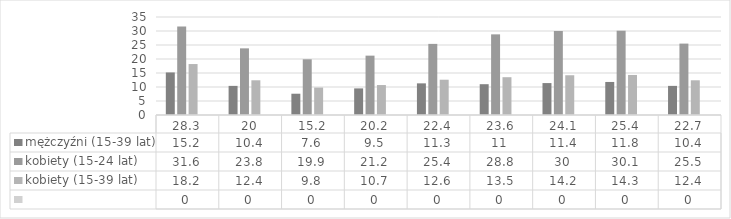
| Category | mężczyźni (15-39 lat) | kobiety (15-24 lat) | kobiety (15-39 lat) | Series 3 |
|---|---|---|---|---|
| 28.3 | 15.2 | 31.6 | 18.2 |  |
| 20.0 | 10.4 | 23.8 | 12.4 |  |
| 15.2 | 7.6 | 19.9 | 9.8 |  |
| 20.2 | 9.5 | 21.2 | 10.7 |  |
| 22.4 | 11.3 | 25.4 | 12.6 |  |
| 23.6 | 11 | 28.8 | 13.5 |  |
| 24.1 | 11.4 | 30 | 14.2 |  |
| 25.4 | 11.8 | 30.1 | 14.3 |  |
| 22.7 | 10.4 | 25.5 | 12.4 |  |